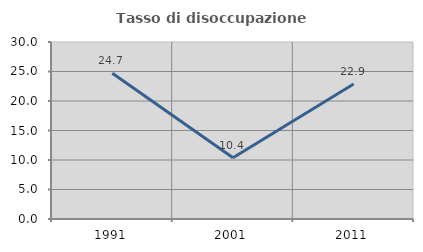
| Category | Tasso di disoccupazione giovanile  |
|---|---|
| 1991.0 | 24.69 |
| 2001.0 | 10.39 |
| 2011.0 | 22.88 |